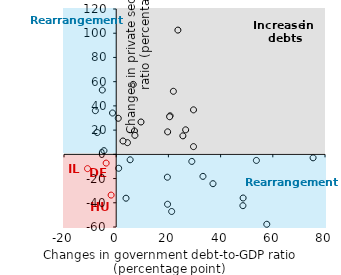
| Category | Series 0 |
|---|---|
| 29.615813999999997 | 6.374 |
| 5.3362670000000065 | -4.498 |
| 9.499168999999995 | 26.702 |
| 21.908676999999997 | 52.039 |
| 20.6392016 | 31.792 |
| 19.712691 | 18.562 |
| 4.310582 | 9.651 |
| 0.9416799999999981 | -11.509 |
| 3.7610703 | -36.231 |
| 26.608241 | 20.227 |
| 29.616985999999997 | 36.73 |
| -3.851669000000001 | -7.24 |
| 75.43518999999999 | -2.873 |
| -1.9479749999999996 | -33.649 |
| 21.247163 | -47.18 |
| -10.990094999999997 | -11.821 |
| 28.972490000000008 | -5.85 |
| 53.71382 | -5.035 |
| 6.990975000000006 | 19.244 |
| 19.678103000000004 | -41.222 |
| 19.608013 | -18.89 |
| 6.521300999999998 | 57.772 |
| -1.4024360000000016 | 34.124 |
| -7.265535999999997 | 17.995 |
| 2.595730000000003 | 11.015 |
| 48.55101900000001 | -42.389 |
| 20.474833999999998 | 31.056 |
| 48.626972 | -36.048 |
| 57.693489 | -57.751 |
| 0.7838700000000003 | 29.774 |
| -5.338780999999997 | 53.109 |
| -7.9804809999999975 | 36.055 |
| 37.081526999999994 | -24.244 |
| 33.243037 | -18.188 |
| 23.640251 | 102.574 |
| 25.550176 | 15.269 |
| -4.691299999999998 | 3.026 |
| 7.1661753 | 15.682 |